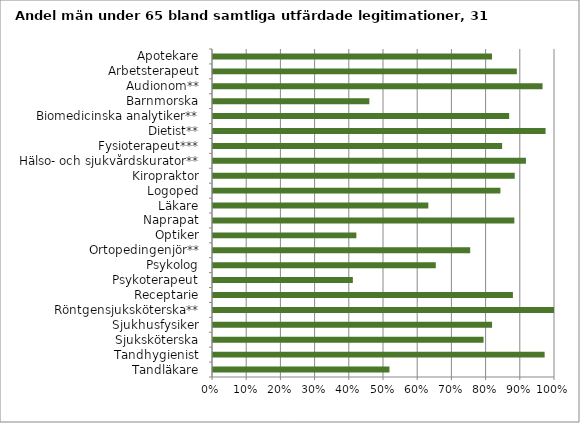
| Category | Män |
|---|---|
| Apotekare | 0.816 |
| Arbetsterapeut | 0.888 |
| Audionom** | 0.964 |
| Barnmorska | 0.457 |
| Biomedicinska analytiker** | 0.866 |
| Dietist** | 0.972 |
| Fysioterapeut*** | 0.845 |
| Hälso- och sjukvårdskurator** | 0.915 |
| Kiropraktor | 0.882 |
| Logoped | 0.84 |
| Läkare | 0.63 |
| Naprapat | 0.881 |
| Optiker | 0.419 |
| Ortopedingenjör** | 0.752 |
| Psykolog | 0.651 |
| Psykoterapeut | 0.409 |
| Receptarie | 0.877 |
| Röntgensjuksköterska** | 0.997 |
| Sjukhusfysiker | 0.816 |
| Sjuksköterska | 0.791 |
| Tandhygienist | 0.97 |
| Tandläkare | 0.516 |